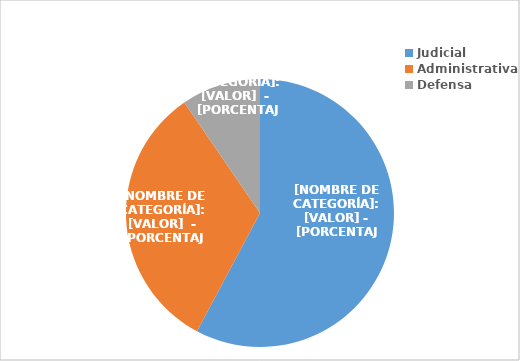
| Category | Series 0 |
|---|---|
| Judicial | 460 |
| Administrativa | 260 |
| Defensa | 76 |